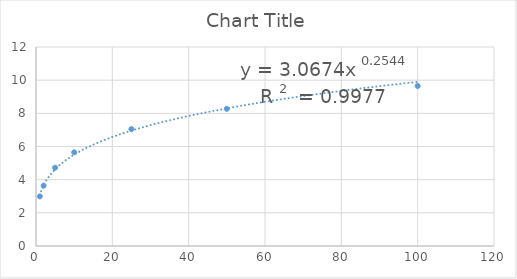
| Category | Series 0 |
|---|---|
| 1.0 | 2.99 |
| 2.0 | 3.64 |
| 5.0 | 4.72 |
| 10.0 | 5.65 |
| 25.0 | 7.05 |
| 50.0 | 8.27 |
| 100.0 | 9.65 |